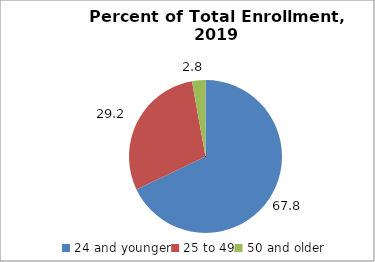
| Category | Series 0 |
|---|---|
| 24 and younger | 67.838 |
| 25 to 49 | 29.225 |
| 50 and older | 2.828 |